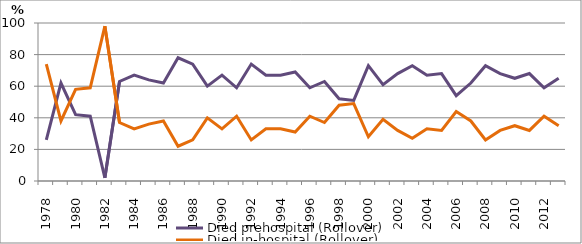
| Category | Died prehospital (Rollover) | Died in-hospital (Rollover) |
|---|---|---|
| 1978.0 | 26 | 74 |
| 1979.0 | 62 | 38 |
| 1980.0 | 42 | 58 |
| 1981.0 | 41 | 59 |
| 1982.0 | 2 | 98 |
| 1983.0 | 63 | 37 |
| 1984.0 | 67 | 33 |
| 1985.0 | 64 | 36 |
| 1986.0 | 62 | 38 |
| 1987.0 | 78 | 22 |
| 1988.0 | 74 | 26 |
| 1989.0 | 60 | 40 |
| 1990.0 | 67 | 33 |
| 1991.0 | 59 | 41 |
| 1992.0 | 74 | 26 |
| 1993.0 | 67 | 33 |
| 1994.0 | 67 | 33 |
| 1995.0 | 69 | 31 |
| 1996.0 | 59 | 41 |
| 1997.0 | 63 | 37 |
| 1998.0 | 52 | 48 |
| 1999.0 | 51 | 49 |
| 2000.0 | 73 | 28 |
| 2001.0 | 61 | 39 |
| 2002.0 | 68 | 32 |
| 2003.0 | 73 | 27 |
| 2004.0 | 67 | 33 |
| 2005.0 | 68 | 32 |
| 2006.0 | 54 | 44 |
| 2007.0 | 62 | 38 |
| 2008.0 | 73 | 26 |
| 2009.0 | 68 | 32 |
| 2010.0 | 65 | 35 |
| 2011.0 | 68 | 32 |
| 2012.0 | 59 | 41 |
| 2013.0 | 65 | 35 |